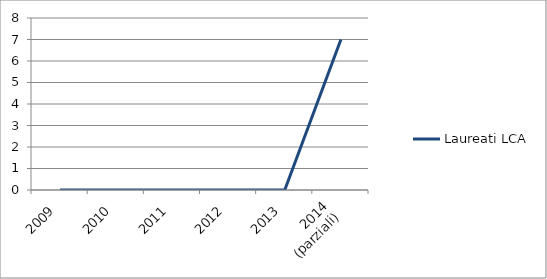
| Category | Laureati LCA |
|---|---|
| 2009 | 0 |
| 2010 | 0 |
| 2011 | 0 |
| 2012 | 0 |
| 2013 | 0 |
| 2014
(parziali) | 7 |